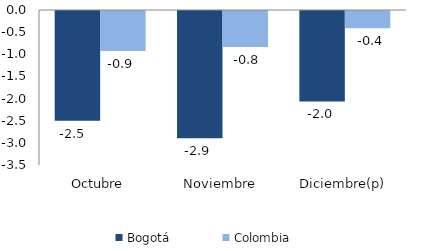
| Category | Bogotá | Colombia |
|---|---|---|
| Octubre | -2.48 | -0.903 |
| Noviembre | -2.872 | -0.812 |
| Diciembre(p) | -2.042 | -0.391 |